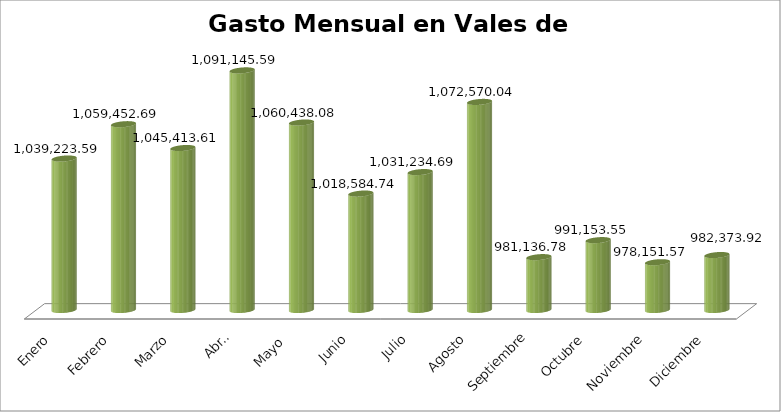
| Category | Suma |
|---|---|
| Enero | 1039223.59 |
| Febrero | 1059452.69 |
| Marzo | 1045413.61 |
| Abril | 1091145.59 |
| Mayo  | 1060438.08 |
| Junio | 1018584.74 |
| Julio | 1031234.69 |
| Agosto | 1072570.04 |
| Septiembre | 981136.78 |
| Octubre | 991153.55 |
| Noviembre | 978151.57 |
| Diciembre | 982373.92 |